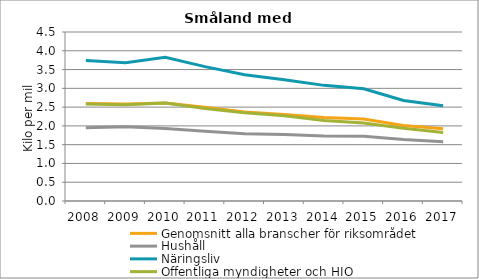
| Category | Genomsnitt alla branscher för riksområdet | Hushåll | Näringsliv | Offentliga myndigheter och HIO |
|---|---|---|---|---|
| 2008 | 2.594 | 1.947 | 3.739 | 2.585 |
| 2009 | 2.583 | 1.978 | 3.684 | 2.563 |
| 2010 | 2.609 | 1.929 | 3.826 | 2.61 |
| 2011 | 2.5 | 1.858 | 3.578 | 2.465 |
| 2012 | 2.373 | 1.791 | 3.363 | 2.347 |
| 2013 | 2.304 | 1.769 | 3.228 | 2.267 |
| 2014 | 2.22 | 1.729 | 3.079 | 2.143 |
| 2015 | 2.181 | 1.722 | 2.988 | 2.077 |
| 2016 | 2.011 | 1.636 | 2.676 | 1.934 |
| 2017 | 1.921 | 1.581 | 2.538 | 1.824 |